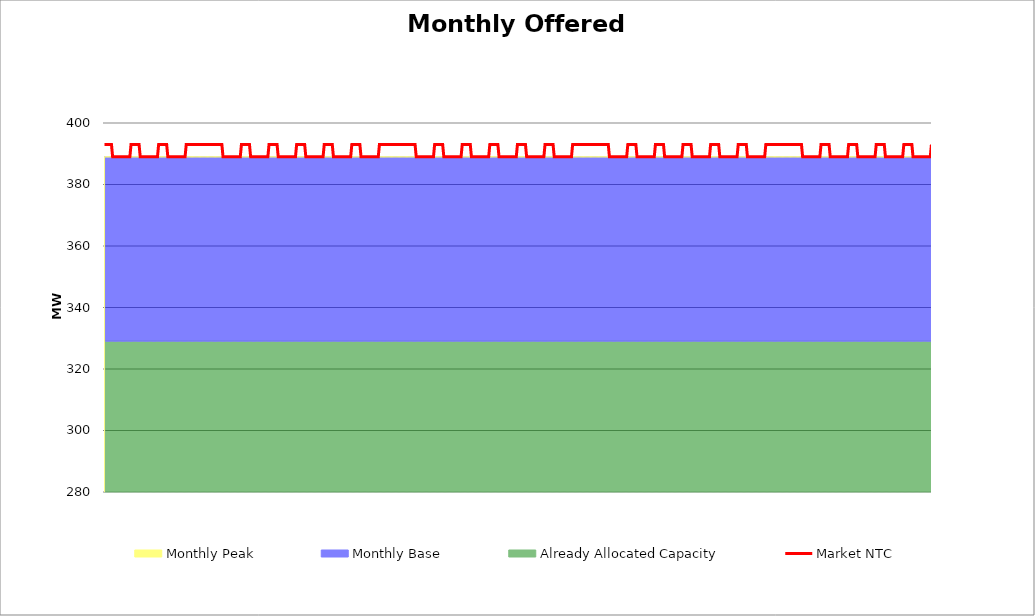
| Category | Market NTC |
|---|---|
| 0 | 393 |
| 1 | 393 |
| 2 | 393 |
| 3 | 393 |
| 4 | 393 |
| 5 | 393 |
| 6 | 393 |
| 7 | 389 |
| 8 | 389 |
| 9 | 389 |
| 10 | 389 |
| 11 | 389 |
| 12 | 389 |
| 13 | 389 |
| 14 | 389 |
| 15 | 389 |
| 16 | 389 |
| 17 | 389 |
| 18 | 389 |
| 19 | 389 |
| 20 | 389 |
| 21 | 389 |
| 22 | 389 |
| 23 | 393 |
| 24 | 393 |
| 25 | 393 |
| 26 | 393 |
| 27 | 393 |
| 28 | 393 |
| 29 | 393 |
| 30 | 393 |
| 31 | 389 |
| 32 | 389 |
| 33 | 389 |
| 34 | 389 |
| 35 | 389 |
| 36 | 389 |
| 37 | 389 |
| 38 | 389 |
| 39 | 389 |
| 40 | 389 |
| 41 | 389 |
| 42 | 389 |
| 43 | 389 |
| 44 | 389 |
| 45 | 389 |
| 46 | 389 |
| 47 | 393 |
| 48 | 393 |
| 49 | 393 |
| 50 | 393 |
| 51 | 393 |
| 52 | 393 |
| 53 | 393 |
| 54 | 393 |
| 55 | 389 |
| 56 | 389 |
| 57 | 389 |
| 58 | 389 |
| 59 | 389 |
| 60 | 389 |
| 61 | 389 |
| 62 | 389 |
| 63 | 389 |
| 64 | 389 |
| 65 | 389 |
| 66 | 389 |
| 67 | 389 |
| 68 | 389 |
| 69 | 389 |
| 70 | 389 |
| 71 | 393 |
| 72 | 393 |
| 73 | 393 |
| 74 | 393 |
| 75 | 393 |
| 76 | 393 |
| 77 | 393 |
| 78 | 393 |
| 79 | 393 |
| 80 | 393 |
| 81 | 393 |
| 82 | 393 |
| 83 | 393 |
| 84 | 393 |
| 85 | 393 |
| 86 | 393 |
| 87 | 393 |
| 88 | 393 |
| 89 | 393 |
| 90 | 393 |
| 91 | 393 |
| 92 | 393 |
| 93 | 393 |
| 94 | 393 |
| 95 | 393 |
| 96 | 393 |
| 97 | 393 |
| 98 | 393 |
| 99 | 393 |
| 100 | 393 |
| 101 | 393 |
| 102 | 393 |
| 103 | 389 |
| 104 | 389 |
| 105 | 389 |
| 106 | 389 |
| 107 | 389 |
| 108 | 389 |
| 109 | 389 |
| 110 | 389 |
| 111 | 389 |
| 112 | 389 |
| 113 | 389 |
| 114 | 389 |
| 115 | 389 |
| 116 | 389 |
| 117 | 389 |
| 118 | 389 |
| 119 | 393 |
| 120 | 393 |
| 121 | 393 |
| 122 | 393 |
| 123 | 393 |
| 124 | 393 |
| 125 | 393 |
| 126 | 393 |
| 127 | 389 |
| 128 | 389 |
| 129 | 389 |
| 130 | 389 |
| 131 | 389 |
| 132 | 389 |
| 133 | 389 |
| 134 | 389 |
| 135 | 389 |
| 136 | 389 |
| 137 | 389 |
| 138 | 389 |
| 139 | 389 |
| 140 | 389 |
| 141 | 389 |
| 142 | 389 |
| 143 | 393 |
| 144 | 393 |
| 145 | 393 |
| 146 | 393 |
| 147 | 393 |
| 148 | 393 |
| 149 | 393 |
| 150 | 393 |
| 151 | 389 |
| 152 | 389 |
| 153 | 389 |
| 154 | 389 |
| 155 | 389 |
| 156 | 389 |
| 157 | 389 |
| 158 | 389 |
| 159 | 389 |
| 160 | 389 |
| 161 | 389 |
| 162 | 389 |
| 163 | 389 |
| 164 | 389 |
| 165 | 389 |
| 166 | 389 |
| 167 | 393 |
| 168 | 393 |
| 169 | 393 |
| 170 | 393 |
| 171 | 393 |
| 172 | 393 |
| 173 | 393 |
| 174 | 393 |
| 175 | 389 |
| 176 | 389 |
| 177 | 389 |
| 178 | 389 |
| 179 | 389 |
| 180 | 389 |
| 181 | 389 |
| 182 | 389 |
| 183 | 389 |
| 184 | 389 |
| 185 | 389 |
| 186 | 389 |
| 187 | 389 |
| 188 | 389 |
| 189 | 389 |
| 190 | 389 |
| 191 | 393 |
| 192 | 393 |
| 193 | 393 |
| 194 | 393 |
| 195 | 393 |
| 196 | 393 |
| 197 | 393 |
| 198 | 393 |
| 199 | 389 |
| 200 | 389 |
| 201 | 389 |
| 202 | 389 |
| 203 | 389 |
| 204 | 389 |
| 205 | 389 |
| 206 | 389 |
| 207 | 389 |
| 208 | 389 |
| 209 | 389 |
| 210 | 389 |
| 211 | 389 |
| 212 | 389 |
| 213 | 389 |
| 214 | 389 |
| 215 | 393 |
| 216 | 393 |
| 217 | 393 |
| 218 | 393 |
| 219 | 393 |
| 220 | 393 |
| 221 | 393 |
| 222 | 393 |
| 223 | 389 |
| 224 | 389 |
| 225 | 389 |
| 226 | 389 |
| 227 | 389 |
| 228 | 389 |
| 229 | 389 |
| 230 | 389 |
| 231 | 389 |
| 232 | 389 |
| 233 | 389 |
| 234 | 389 |
| 235 | 389 |
| 236 | 389 |
| 237 | 389 |
| 238 | 389 |
| 239 | 393 |
| 240 | 393 |
| 241 | 393 |
| 242 | 393 |
| 243 | 393 |
| 244 | 393 |
| 245 | 393 |
| 246 | 393 |
| 247 | 393 |
| 248 | 393 |
| 249 | 393 |
| 250 | 393 |
| 251 | 393 |
| 252 | 393 |
| 253 | 393 |
| 254 | 393 |
| 255 | 393 |
| 256 | 393 |
| 257 | 393 |
| 258 | 393 |
| 259 | 393 |
| 260 | 393 |
| 261 | 393 |
| 262 | 393 |
| 263 | 393 |
| 264 | 393 |
| 265 | 393 |
| 266 | 393 |
| 267 | 393 |
| 268 | 393 |
| 269 | 393 |
| 270 | 393 |
| 271 | 389 |
| 272 | 389 |
| 273 | 389 |
| 274 | 389 |
| 275 | 389 |
| 276 | 389 |
| 277 | 389 |
| 278 | 389 |
| 279 | 389 |
| 280 | 389 |
| 281 | 389 |
| 282 | 389 |
| 283 | 389 |
| 284 | 389 |
| 285 | 389 |
| 286 | 389 |
| 287 | 393 |
| 288 | 393 |
| 289 | 393 |
| 290 | 393 |
| 291 | 393 |
| 292 | 393 |
| 293 | 393 |
| 294 | 393 |
| 295 | 389 |
| 296 | 389 |
| 297 | 389 |
| 298 | 389 |
| 299 | 389 |
| 300 | 389 |
| 301 | 389 |
| 302 | 389 |
| 303 | 389 |
| 304 | 389 |
| 305 | 389 |
| 306 | 389 |
| 307 | 389 |
| 308 | 389 |
| 309 | 389 |
| 310 | 389 |
| 311 | 393 |
| 312 | 393 |
| 313 | 393 |
| 314 | 393 |
| 315 | 393 |
| 316 | 393 |
| 317 | 393 |
| 318 | 393 |
| 319 | 389 |
| 320 | 389 |
| 321 | 389 |
| 322 | 389 |
| 323 | 389 |
| 324 | 389 |
| 325 | 389 |
| 326 | 389 |
| 327 | 389 |
| 328 | 389 |
| 329 | 389 |
| 330 | 389 |
| 331 | 389 |
| 332 | 389 |
| 333 | 389 |
| 334 | 389 |
| 335 | 393 |
| 336 | 393 |
| 337 | 393 |
| 338 | 393 |
| 339 | 393 |
| 340 | 393 |
| 341 | 393 |
| 342 | 393 |
| 343 | 389 |
| 344 | 389 |
| 345 | 389 |
| 346 | 389 |
| 347 | 389 |
| 348 | 389 |
| 349 | 389 |
| 350 | 389 |
| 351 | 389 |
| 352 | 389 |
| 353 | 389 |
| 354 | 389 |
| 355 | 389 |
| 356 | 389 |
| 357 | 389 |
| 358 | 389 |
| 359 | 393 |
| 360 | 393 |
| 361 | 393 |
| 362 | 393 |
| 363 | 393 |
| 364 | 393 |
| 365 | 393 |
| 366 | 393 |
| 367 | 389 |
| 368 | 389 |
| 369 | 389 |
| 370 | 389 |
| 371 | 389 |
| 372 | 389 |
| 373 | 389 |
| 374 | 389 |
| 375 | 389 |
| 376 | 389 |
| 377 | 389 |
| 378 | 389 |
| 379 | 389 |
| 380 | 389 |
| 381 | 389 |
| 382 | 389 |
| 383 | 393 |
| 384 | 393 |
| 385 | 393 |
| 386 | 393 |
| 387 | 393 |
| 388 | 393 |
| 389 | 393 |
| 390 | 393 |
| 391 | 389 |
| 392 | 389 |
| 393 | 389 |
| 394 | 389 |
| 395 | 389 |
| 396 | 389 |
| 397 | 389 |
| 398 | 389 |
| 399 | 389 |
| 400 | 389 |
| 401 | 389 |
| 402 | 389 |
| 403 | 389 |
| 404 | 389 |
| 405 | 389 |
| 406 | 389 |
| 407 | 393 |
| 408 | 393 |
| 409 | 393 |
| 410 | 393 |
| 411 | 393 |
| 412 | 393 |
| 413 | 393 |
| 414 | 393 |
| 415 | 393 |
| 416 | 393 |
| 417 | 393 |
| 418 | 393 |
| 419 | 393 |
| 420 | 393 |
| 421 | 393 |
| 422 | 393 |
| 423 | 393 |
| 424 | 393 |
| 425 | 393 |
| 426 | 393 |
| 427 | 393 |
| 428 | 393 |
| 429 | 393 |
| 430 | 393 |
| 431 | 393 |
| 432 | 393 |
| 433 | 393 |
| 434 | 393 |
| 435 | 393 |
| 436 | 393 |
| 437 | 393 |
| 438 | 393 |
| 439 | 389 |
| 440 | 389 |
| 441 | 389 |
| 442 | 389 |
| 443 | 389 |
| 444 | 389 |
| 445 | 389 |
| 446 | 389 |
| 447 | 389 |
| 448 | 389 |
| 449 | 389 |
| 450 | 389 |
| 451 | 389 |
| 452 | 389 |
| 453 | 389 |
| 454 | 389 |
| 455 | 393 |
| 456 | 393 |
| 457 | 393 |
| 458 | 393 |
| 459 | 393 |
| 460 | 393 |
| 461 | 393 |
| 462 | 393 |
| 463 | 389 |
| 464 | 389 |
| 465 | 389 |
| 466 | 389 |
| 467 | 389 |
| 468 | 389 |
| 469 | 389 |
| 470 | 389 |
| 471 | 389 |
| 472 | 389 |
| 473 | 389 |
| 474 | 389 |
| 475 | 389 |
| 476 | 389 |
| 477 | 389 |
| 478 | 389 |
| 479 | 393 |
| 480 | 393 |
| 481 | 393 |
| 482 | 393 |
| 483 | 393 |
| 484 | 393 |
| 485 | 393 |
| 486 | 393 |
| 487 | 389 |
| 488 | 389 |
| 489 | 389 |
| 490 | 389 |
| 491 | 389 |
| 492 | 389 |
| 493 | 389 |
| 494 | 389 |
| 495 | 389 |
| 496 | 389 |
| 497 | 389 |
| 498 | 389 |
| 499 | 389 |
| 500 | 389 |
| 501 | 389 |
| 502 | 389 |
| 503 | 393 |
| 504 | 393 |
| 505 | 393 |
| 506 | 393 |
| 507 | 393 |
| 508 | 393 |
| 509 | 393 |
| 510 | 393 |
| 511 | 389 |
| 512 | 389 |
| 513 | 389 |
| 514 | 389 |
| 515 | 389 |
| 516 | 389 |
| 517 | 389 |
| 518 | 389 |
| 519 | 389 |
| 520 | 389 |
| 521 | 389 |
| 522 | 389 |
| 523 | 389 |
| 524 | 389 |
| 525 | 389 |
| 526 | 389 |
| 527 | 393 |
| 528 | 393 |
| 529 | 393 |
| 530 | 393 |
| 531 | 393 |
| 532 | 393 |
| 533 | 393 |
| 534 | 393 |
| 535 | 389 |
| 536 | 389 |
| 537 | 389 |
| 538 | 389 |
| 539 | 389 |
| 540 | 389 |
| 541 | 389 |
| 542 | 389 |
| 543 | 389 |
| 544 | 389 |
| 545 | 389 |
| 546 | 389 |
| 547 | 389 |
| 548 | 389 |
| 549 | 389 |
| 550 | 389 |
| 551 | 393 |
| 552 | 393 |
| 553 | 393 |
| 554 | 393 |
| 555 | 393 |
| 556 | 393 |
| 557 | 393 |
| 558 | 393 |
| 559 | 389 |
| 560 | 389 |
| 561 | 389 |
| 562 | 389 |
| 563 | 389 |
| 564 | 389 |
| 565 | 389 |
| 566 | 389 |
| 567 | 389 |
| 568 | 389 |
| 569 | 389 |
| 570 | 389 |
| 571 | 389 |
| 572 | 389 |
| 573 | 389 |
| 574 | 389 |
| 575 | 393 |
| 576 | 393 |
| 577 | 393 |
| 578 | 393 |
| 579 | 393 |
| 580 | 393 |
| 581 | 393 |
| 582 | 393 |
| 583 | 393 |
| 584 | 393 |
| 585 | 393 |
| 586 | 393 |
| 587 | 393 |
| 588 | 393 |
| 589 | 393 |
| 590 | 393 |
| 591 | 393 |
| 592 | 393 |
| 593 | 393 |
| 594 | 393 |
| 595 | 393 |
| 596 | 393 |
| 597 | 393 |
| 598 | 393 |
| 599 | 393 |
| 600 | 393 |
| 601 | 393 |
| 602 | 393 |
| 603 | 393 |
| 604 | 393 |
| 605 | 393 |
| 606 | 393 |
| 607 | 389 |
| 608 | 389 |
| 609 | 389 |
| 610 | 389 |
| 611 | 389 |
| 612 | 389 |
| 613 | 389 |
| 614 | 389 |
| 615 | 389 |
| 616 | 389 |
| 617 | 389 |
| 618 | 389 |
| 619 | 389 |
| 620 | 389 |
| 621 | 389 |
| 622 | 389 |
| 623 | 393 |
| 624 | 393 |
| 625 | 393 |
| 626 | 393 |
| 627 | 393 |
| 628 | 393 |
| 629 | 393 |
| 630 | 393 |
| 631 | 389 |
| 632 | 389 |
| 633 | 389 |
| 634 | 389 |
| 635 | 389 |
| 636 | 389 |
| 637 | 389 |
| 638 | 389 |
| 639 | 389 |
| 640 | 389 |
| 641 | 389 |
| 642 | 389 |
| 643 | 389 |
| 644 | 389 |
| 645 | 389 |
| 646 | 389 |
| 647 | 393 |
| 648 | 393 |
| 649 | 393 |
| 650 | 393 |
| 651 | 393 |
| 652 | 393 |
| 653 | 393 |
| 654 | 393 |
| 655 | 389 |
| 656 | 389 |
| 657 | 389 |
| 658 | 389 |
| 659 | 389 |
| 660 | 389 |
| 661 | 389 |
| 662 | 389 |
| 663 | 389 |
| 664 | 389 |
| 665 | 389 |
| 666 | 389 |
| 667 | 389 |
| 668 | 389 |
| 669 | 389 |
| 670 | 389 |
| 671 | 393 |
| 672 | 393 |
| 673 | 393 |
| 674 | 393 |
| 675 | 393 |
| 676 | 393 |
| 677 | 393 |
| 678 | 393 |
| 679 | 389 |
| 680 | 389 |
| 681 | 389 |
| 682 | 389 |
| 683 | 389 |
| 684 | 389 |
| 685 | 389 |
| 686 | 389 |
| 687 | 389 |
| 688 | 389 |
| 689 | 389 |
| 690 | 389 |
| 691 | 389 |
| 692 | 389 |
| 693 | 389 |
| 694 | 389 |
| 695 | 393 |
| 696 | 393 |
| 697 | 393 |
| 698 | 393 |
| 699 | 393 |
| 700 | 393 |
| 701 | 393 |
| 702 | 393 |
| 703 | 389 |
| 704 | 389 |
| 705 | 389 |
| 706 | 389 |
| 707 | 389 |
| 708 | 389 |
| 709 | 389 |
| 710 | 389 |
| 711 | 389 |
| 712 | 389 |
| 713 | 389 |
| 714 | 389 |
| 715 | 389 |
| 716 | 389 |
| 717 | 389 |
| 718 | 389 |
| 719 | 393 |